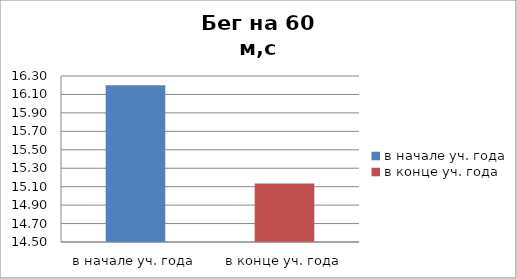
| Category | Series 0 |
|---|---|
| в начале уч. года | 16.2 |
| в конце уч. года | 15.133 |